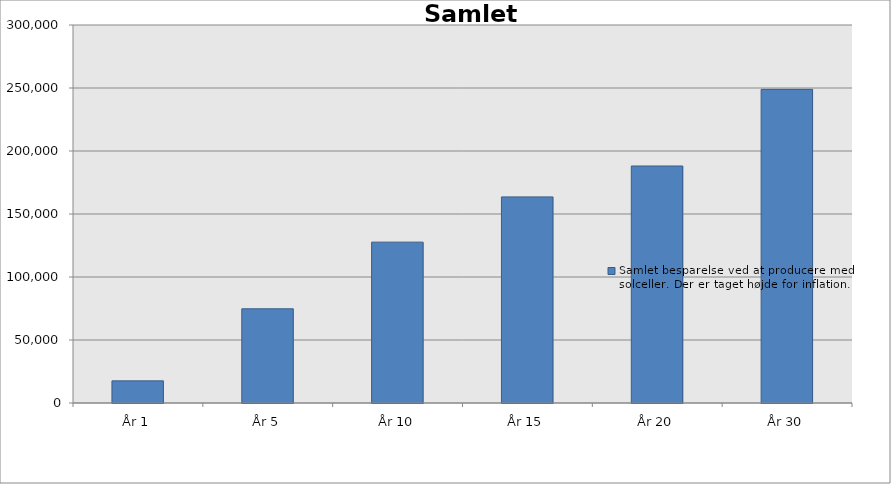
| Category | Samlet besparelse ved at producere med solceller. Der er taget højde for inflation.  |
|---|---|
| År 1 | 17561.88 |
| År 5 | 74773.214 |
| År 10 | 127669.603 |
| År 15 | 163571.837 |
| År 20 | 188098.161 |
| År 30 | 248913.351 |